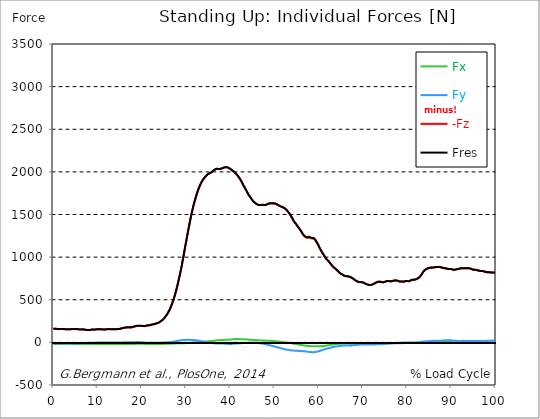
| Category |  Fx |  Fy |  -Fz |  Fres |
|---|---|---|---|---|
| 0.0 | -18 | -13.7 | 156.7 | 158.39 |
| 0.167348456675344 | -18.13 | -13.66 | 158 | 159.68 |
| 0.334696913350688 | -18.24 | -13.47 | 159.26 | 160.92 |
| 0.5020453700260321 | -18.19 | -13.06 | 158.64 | 160.27 |
| 0.669393826701376 | -18.13 | -12.86 | 157.77 | 159.38 |
| 0.83674228337672 | -17.98 | -12.6 | 157.06 | 158.64 |
| 1.0040907400520642 | -17.77 | -12.73 | 155.28 | 156.86 |
| 1.1621420602454444 | -17.77 | -13.19 | 154.67 | 156.3 |
| 1.3294905169207885 | -17.8 | -13.38 | 155.06 | 156.71 |
| 1.4968389735961325 | -17.82 | -13.44 | 155.63 | 157.28 |
| 1.6641874302714765 | -17.86 | -13.28 | 156.57 | 158.2 |
| 1.8315358869468206 | -17.8 | -12.83 | 157.01 | 158.59 |
| 1.9988843436221646 | -17.63 | -12.42 | 156.59 | 158.12 |
| 2.1662328002975086 | -17.47 | -12.3 | 156.05 | 157.56 |
| 2.333581256972853 | -17.38 | -12.37 | 154.94 | 156.46 |
| 2.5009297136481967 | -17.35 | -12.42 | 154.86 | 156.38 |
| 2.6682781703235405 | -17.19 | -11.86 | 154.08 | 155.54 |
| 2.8356266269988843 | -17.06 | -11.65 | 152.4 | 153.85 |
| 3.002975083674229 | -17.08 | -11.97 | 151.99 | 153.47 |
| 3.1703235403495724 | -17.25 | -12.08 | 152.83 | 154.33 |
| 3.337671997024917 | -17.36 | -11.73 | 153.38 | 154.85 |
| 3.4957233172182973 | -17.31 | -11.35 | 152.63 | 154.08 |
| 3.663071773893641 | -17.22 | -11.45 | 151.6 | 153.06 |
| 3.8304202305689854 | -17.47 | -11.9 | 152.64 | 154.15 |
| 3.997768687244329 | -17.7 | -12.18 | 154.41 | 155.94 |
| 4.165117143919673 | -17.82 | -11.82 | 155.73 | 157.24 |
| 4.332465600595017 | -17.82 | -11.31 | 156.08 | 157.55 |
| 4.499814057270361 | -17.78 | -11.21 | 155.1 | 156.56 |
| 4.667162513945706 | -17.8 | -11.35 | 153.89 | 155.39 |
| 4.834510970621049 | -17.97 | -11.43 | 154.51 | 156.04 |
| 5.001859427296393 | -18.07 | -11.4 | 155.52 | 157.05 |
| 5.169207883971737 | -18.12 | -10.92 | 156.31 | 157.81 |
| 5.336556340647081 | -17.92 | -10.04 | 155.46 | 156.89 |
| 5.503904797322425 | -17.82 | -9.98 | 153.88 | 155.31 |
| 5.671253253997769 | -17.9 | -9.58 | 152.66 | 154.09 |
| 5.82930457419115 | -17.9 | -9.61 | 150.69 | 152.14 |
| 5.996653030866494 | -17.9 | -9.68 | 150.47 | 151.93 |
| 6.164001487541838 | -17.97 | -9.57 | 150.63 | 152.11 |
| 6.331349944217181 | -18.12 | -9.41 | 151.04 | 152.53 |
| 6.498698400892526 | -18.3 | -9.04 | 151.43 | 152.93 |
| 6.66604685756787 | -18.61 | -8.69 | 151.46 | 152.98 |
| 6.833395314243213 | -18.87 | -8.15 | 150.94 | 152.47 |
| 7.000743770918558 | -18.89 | -7.53 | 149.54 | 151.05 |
| 7.168092227593902 | -18.88 | -7.05 | 148.2 | 149.7 |
| 7.335440684269246 | -18.75 | -6.93 | 146.45 | 147.94 |
| 7.50278914094459 | -18.63 | -6.68 | 145.25 | 146.73 |
| 7.6701375976199335 | -18.51 | -6.31 | 144.58 | 146.04 |
| 7.837486054295278 | -18.39 | -5.92 | 143.96 | 145.41 |
| 7.995537374488658 | -18.16 | -5.35 | 144 | 145.43 |
| 8.162885831164003 | -18.17 | -4.9 | 144.57 | 145.99 |
| 8.330234287839346 | -18.31 | -4.98 | 145.85 | 147.29 |
| 8.49758274451469 | -18.43 | -4.96 | 147.71 | 149.15 |
| 8.664931201190035 | -18.41 | -4.55 | 149.41 | 150.81 |
| 8.832279657865378 | -18.37 | -4.04 | 150.01 | 151.38 |
| 8.999628114540721 | -18.37 | -3.73 | 149.81 | 151.17 |
| 9.166976571216066 | -18.36 | -3.62 | 149.46 | 150.81 |
| 9.334325027891412 | -18.34 | -3.56 | 149.06 | 150.42 |
| 9.501673484566755 | -18.49 | -3.62 | 150.53 | 151.9 |
| 9.669021941242098 | -18.7 | -3.65 | 152.16 | 153.56 |
| 9.836370397917442 | -18.59 | -2.89 | 153.3 | 154.65 |
| 10.003718854592787 | -18.63 | -2.56 | 153.55 | 154.89 |
| 10.17106731126813 | -18.68 | -2.28 | 153.68 | 155.02 |
| 10.329118631461512 | -18.64 | -2.42 | 152.86 | 154.2 |
| 10.496467088136853 | -18.56 | -2.42 | 153.38 | 154.71 |
| 10.663815544812199 | -18.47 | -2.34 | 153.77 | 155.08 |
| 10.831164001487544 | -18.38 | -2.05 | 153.62 | 154.92 |
| 10.998512458162887 | -18.31 | -1.89 | 152.34 | 153.64 |
| 11.16586091483823 | -18.23 | -1.89 | 150.93 | 152.22 |
| 11.333209371513574 | -18.25 | -2 | 150.14 | 151.44 |
| 11.50055782818892 | -18.33 | -2.29 | 149.81 | 151.12 |
| 11.667906284864264 | -18.38 | -2.48 | 150.41 | 151.71 |
| 11.835254741539607 | -18.33 | -2.5 | 152.01 | 153.28 |
| 12.00260319821495 | -18.25 | -2.43 | 153.45 | 154.7 |
| 12.169951654890292 | -18.13 | -2.05 | 154 | 155.22 |
| 12.337300111565641 | -18.21 | -2.43 | 154.31 | 155.54 |
| 12.504648568240984 | -18.23 | -2.66 | 154.82 | 156.05 |
| 12.662699888434362 | -18.13 | -2.49 | 155.11 | 156.32 |
| 12.830048345109708 | -18.01 | -2.18 | 153.88 | 155.07 |
| 12.997396801785053 | -17.99 | -2.36 | 152.75 | 153.95 |
| 13.164745258460396 | -18.13 | -2.88 | 152.42 | 153.64 |
| 13.33209371513574 | -18.23 | -2.87 | 153.43 | 154.66 |
| 13.499442171811083 | -18.41 | -2.76 | 154.88 | 156.12 |
| 13.666790628486426 | -18.5 | -2.54 | 154.88 | 156.13 |
| 13.834139085161771 | -18.41 | -2.07 | 153.66 | 154.9 |
| 14.001487541837117 | -18.52 | -2.2 | 152.57 | 153.83 |
| 14.16883599851246 | -18.53 | -2.5 | 153.38 | 154.64 |
| 14.336184455187803 | -18.46 | -2.59 | 155.01 | 156.26 |
| 14.503532911863147 | -18.31 | -2.41 | 155.42 | 156.65 |
| 14.670881368538492 | -18.23 | -2.43 | 154.96 | 156.2 |
| 14.828932688731873 | -18.24 | -2.63 | 155.51 | 156.77 |
| 14.996281145407215 | -18.24 | -2.78 | 157.38 | 158.66 |
| 15.163629602082558 | -18.09 | -2.35 | 159.75 | 161.04 |
| 15.330978058757903 | -17.92 | -1.74 | 162.18 | 163.5 |
| 15.498326515433247 | -17.85 | -1.1 | 165.1 | 166.47 |
| 15.665674972108594 | -17.75 | -0.16 | 167.53 | 169 |
| 15.833023428783937 | -17.77 | 0.36 | 168.98 | 170.51 |
| 16.00037188545928 | -17.94 | 0.38 | 170.63 | 172.21 |
| 16.167720342134626 | -18.04 | 0.73 | 172.33 | 173.93 |
| 16.335068798809967 | -18.09 | 1.09 | 173.56 | 175.18 |
| 16.502417255485312 | -18.09 | 1.44 | 174.35 | 176 |
| 16.669765712160658 | -18.09 | 1.83 | 174.81 | 176.49 |
| 16.837114168836 | -18.15 | 1.76 | 174.39 | 176.09 |
| 17.004462625511344 | -18.25 | 1.45 | 174.57 | 176.29 |
| 17.16251394570472 | -18.12 | 1.61 | 176.08 | 177.82 |
| 17.32986240238007 | -18.04 | 2 | 175.88 | 177.65 |
| 17.497210859055414 | -18.15 | 1.71 | 175.24 | 177.05 |
| 17.664559315730756 | -18.4 | 1.23 | 175.79 | 177.64 |
| 17.8319077724061 | -18.56 | 0.99 | 177.67 | 179.58 |
| 17.999256229081443 | -18.66 | 0.98 | 180.21 | 182.15 |
| 18.166604685756788 | -18.73 | 1.04 | 182.56 | 184.58 |
| 18.333953142432133 | -18.52 | 1.76 | 185.07 | 187.24 |
| 18.501301599107478 | -18.01 | 2.73 | 187.87 | 190.16 |
| 18.668650055782823 | -17.3 | 3.46 | 190.7 | 193.05 |
| 18.835998512458165 | -16.69 | 3.7 | 191.84 | 194.19 |
| 19.00334696913351 | -16.03 | 3.8 | 192.99 | 195.33 |
| 19.170695425808855 | -15.79 | 3.71 | 193.76 | 196.04 |
| 19.338043882484197 | -16.07 | 3.05 | 193.34 | 195.56 |
| 19.496095202677576 | -16.23 | 2.74 | 193.9 | 196.1 |
| 19.66344365935292 | -16.38 | 2.32 | 193.6 | 195.75 |
| 19.830792116028263 | -16.66 | 1.21 | 192.34 | 194.35 |
| 19.998140572703612 | -16.94 | 0.7 | 192.71 | 194.71 |
| 20.165489029378953 | -17.24 | 0.11 | 192 | 193.95 |
| 20.3328374860543 | -17.54 | -0.92 | 190.71 | 192.55 |
| 20.500185942729644 | -17.67 | -1.8 | 189.41 | 191.18 |
| 20.667534399404985 | -17.73 | -2.51 | 189.93 | 191.69 |
| 20.83488285608033 | -18.03 | -3.19 | 192.22 | 194.04 |
| 21.002231312755672 | -18.19 | -3.18 | 195.06 | 196.88 |
| 21.16957976943102 | -18.22 | -2.98 | 196.82 | 198.61 |
| 21.336928226106362 | -18.33 | -3.16 | 197.94 | 199.75 |
| 21.504276682781704 | -18.35 | -3.37 | 198.57 | 200.39 |
| 21.67162513945705 | -18.27 | -3.62 | 198.68 | 200.52 |
| 21.82967645965043 | -18.39 | -4.31 | 200.14 | 202.02 |
| 21.997024916325774 | -18.56 | -4.76 | 203.01 | 204.91 |
| 22.16437337300112 | -18.62 | -4.74 | 206.68 | 208.55 |
| 22.33172182967646 | -18.63 | -4.46 | 209.12 | 210.96 |
| 22.499070286351806 | -18.52 | -4.43 | 209.62 | 211.45 |
| 22.666418743027148 | -18.5 | -4.78 | 210.78 | 212.62 |
| 22.833767199702496 | -18.67 | -4.91 | 213.18 | 215.01 |
| 23.00111565637784 | -18.83 | -5.17 | 215.79 | 217.63 |
| 23.168464113053183 | -18.93 | -5.25 | 219.34 | 221.18 |
| 23.335812569728528 | -19.01 | -4.93 | 222.4 | 224.21 |
| 23.50316102640387 | -18.97 | -4.7 | 224.47 | 226.25 |
| 23.670509483079215 | -18.87 | -4.49 | 226.39 | 228.14 |
| 23.83785793975456 | -18.95 | -4.62 | 229.83 | 231.58 |
| 23.995909259947936 | -18.91 | -4.54 | 236.01 | 237.71 |
| 24.163257716623285 | -18.79 | -4 | 242.75 | 244.38 |
| 24.330606173298627 | -18.43 | -3.15 | 249.29 | 250.83 |
| 24.49795462997397 | -18.12 | -2.71 | 255.14 | 256.6 |
| 24.665303086649313 | -17.83 | -2.32 | 260.92 | 262.3 |
| 24.83265154332466 | -17.73 | -2.13 | 269.02 | 270.36 |
| 25.0 | -17.51 | -2.04 | 278.89 | 280.18 |
| 25.167348456675345 | -17.27 | -1.56 | 290.35 | 291.58 |
| 25.334696913350694 | -16.93 | -1.01 | 302.06 | 303.18 |
| 25.502045370026035 | -16.48 | -0.07 | 313.33 | 314.35 |
| 25.669393826701377 | -16.14 | 0.85 | 324.57 | 325.51 |
| 25.836742283376722 | -16.22 | 1.44 | 338.69 | 339.58 |
| 26.004090740052067 | -16.34 | 2.07 | 354.14 | 354.99 |
| 26.17143919672741 | -16.54 | 2.35 | 370.57 | 371.38 |
| 26.329490516920792 | -16.65 | 2.4 | 387.82 | 388.58 |
| 26.49683897359613 | -16.37 | 3.11 | 407.82 | 408.55 |
| 26.66418743027148 | -15.93 | 4.35 | 429 | 429.7 |
| 26.831535886946828 | -15.37 | 5.32 | 451.45 | 452.15 |
| 26.998884343622166 | -14.64 | 6.81 | 475.49 | 476.18 |
| 27.166232800297514 | -13.86 | 8.31 | 501.09 | 501.79 |
| 27.333581256972852 | -13.25 | 9.6 | 528.62 | 529.32 |
| 27.5009297136482 | -12.61 | 11.46 | 558.7 | 559.43 |
| 27.668278170323543 | -12.09 | 13.47 | 589.62 | 590.41 |
| 27.835626626998888 | -11.64 | 15.19 | 621.82 | 622.63 |
| 28.002975083674233 | -11.31 | 16.83 | 656.63 | 657.46 |
| 28.170323540349575 | -11.19 | 18.7 | 693.15 | 694.02 |
| 28.33767199702492 | -11.09 | 20.37 | 731.63 | 732.52 |
| 28.50502045370026 | -11.07 | 21.91 | 770.28 | 771.19 |
| 28.663071773893645 | -11.26 | 23.34 | 808.34 | 809.26 |
| 28.830420230568986 | -11.63 | 24.38 | 848.52 | 849.42 |
| 28.99776868724433 | -11.74 | 25.42 | 891.6 | 892.49 |
| 29.165117143919673 | -11.05 | 26.66 | 938.45 | 939.33 |
| 29.33246560059502 | -10.67 | 27.4 | 986.06 | 986.9 |
| 29.499814057270367 | -10.36 | 28.15 | 1032.79 | 1033.61 |
| 29.66716251394571 | -9.78 | 28.75 | 1080.81 | 1081.61 |
| 29.834510970621054 | -9.18 | 29.43 | 1130.48 | 1131.26 |
| 30.00185942729639 | -8.86 | 29.84 | 1175.79 | 1176.55 |
| 30.169207883971744 | -8.08 | 30.2 | 1222 | 1222.74 |
| 30.33655634064708 | -7.12 | 30.46 | 1268.85 | 1269.56 |
| 30.50390479732243 | -6.32 | 30.45 | 1315.56 | 1316.24 |
| 30.671253253997772 | -5.66 | 30.34 | 1361.31 | 1361.96 |
| 30.829304574191156 | -5.1 | 29.86 | 1405.2 | 1405.81 |
| 30.996653030866494 | -4.58 | 29.2 | 1448.47 | 1449.06 |
| 31.164001487541842 | -3.99 | 28.87 | 1489.33 | 1489.91 |
| 31.331349944217187 | -3.25 | 28.56 | 1528.22 | 1528.78 |
| 31.498698400892525 | -2.4 | 27.92 | 1565.98 | 1566.54 |
| 31.666046857567874 | -1.49 | 27.14 | 1601.75 | 1602.3 |
| 31.833395314243212 | -0.62 | 26.53 | 1634.68 | 1635.22 |
| 32.00074377091856 | 0.19 | 26.1 | 1665.57 | 1666.11 |
| 32.1680922275939 | 0.95 | 25.46 | 1695.13 | 1695.66 |
| 32.33544068426925 | 1.66 | 23.81 | 1724.49 | 1725 |
| 32.50278914094459 | 2.36 | 22.24 | 1752.42 | 1752.92 |
| 32.670137597619934 | 3.06 | 20.95 | 1778.27 | 1778.75 |
| 32.83748605429528 | 3.78 | 19.66 | 1802.02 | 1802.49 |
| 33.004834510970625 | 4.55 | 18.46 | 1823.48 | 1823.93 |
| 33.162885831164004 | 5.2 | 16.96 | 1843.32 | 1843.77 |
| 33.33023428783935 | 5.68 | 15.09 | 1861.81 | 1862.24 |
| 33.497582744514695 | 6.23 | 13.24 | 1878.95 | 1879.35 |
| 33.664931201190036 | 7.07 | 11.52 | 1894.29 | 1894.68 |
| 33.83227965786538 | 7.79 | 9.78 | 1908.14 | 1908.51 |
| 33.99962811454073 | 8.3 | 8.02 | 1920.41 | 1920.76 |
| 34.16697657121607 | 8.93 | 6.55 | 1931.32 | 1931.65 |
| 34.33432502789141 | 9.41 | 4.84 | 1941.81 | 1942.13 |
| 34.50167348456676 | 10.22 | 3.39 | 1951.05 | 1951.37 |
| 34.6690219412421 | 11.12 | 1.86 | 1960.36 | 1960.68 |
| 34.83637039791744 | 12.01 | 0.33 | 1969.67 | 1969.98 |
| 35.00371885459279 | 12.69 | -1.19 | 1976.15 | 1976.46 |
| 35.17106731126814 | 13.4 | -2.22 | 1979.93 | 1980.24 |
| 35.338415767943474 | 13.69 | -2.87 | 1981.57 | 1981.87 |
| 35.49646708813686 | 14.26 | -4.26 | 1986.96 | 1987.24 |
| 35.6638155448122 | 15.1 | -5.53 | 1993.25 | 1993.52 |
| 35.831164001487544 | 16.19 | -6.61 | 2000.28 | 2000.55 |
| 35.998512458162885 | 17.02 | -7.99 | 2007.52 | 2007.79 |
| 36.165860914838234 | 18.1 | -9.53 | 2014.99 | 2015.26 |
| 36.333209371513576 | 19.58 | -10.51 | 2021.54 | 2021.81 |
| 36.50055782818892 | 20.82 | -11.67 | 2027.09 | 2027.38 |
| 36.667906284864266 | 21.76 | -12.68 | 2031.19 | 2031.5 |
| 36.83525474153961 | 22.9 | -13.51 | 2034.44 | 2034.76 |
| 37.002603198214956 | 23.93 | -14.08 | 2036.03 | 2036.37 |
| 37.1699516548903 | 24.86 | -13.87 | 2035.58 | 2035.93 |
| 37.337300111565646 | 25.52 | -13.66 | 2034.29 | 2034.65 |
| 37.50464856824098 | 25.79 | -13.68 | 2033.41 | 2033.77 |
| 37.66269988843437 | 26.67 | -13.5 | 2035.01 | 2035.39 |
| 37.83004834510971 | 27.15 | -13.6 | 2036.82 | 2037.21 |
| 37.99739680178505 | 27.73 | -13.7 | 2038.6 | 2039 |
| 38.16474525846039 | 28.37 | -13.64 | 2040.92 | 2041.32 |
| 38.33209371513574 | 28.46 | -13.94 | 2044.74 | 2045.14 |
| 38.49944217181109 | 28.45 | -14.73 | 2048.79 | 2049.19 |
| 38.666790628486424 | 28.44 | -15.73 | 2052.42 | 2052.82 |
| 38.83413908516178 | 28.81 | -16.33 | 2054.01 | 2054.41 |
| 39.001487541837115 | 29.94 | -16.35 | 2054.56 | 2054.98 |
| 39.16883599851246 | 30.34 | -16.96 | 2054.3 | 2054.72 |
| 39.336184455187805 | 30.7 | -17.72 | 2052.54 | 2052.97 |
| 39.503532911863154 | 31.36 | -17.96 | 2049.43 | 2049.86 |
| 39.670881368538495 | 31.71 | -18.27 | 2045.4 | 2045.83 |
| 39.83822982521384 | 32.09 | -18.59 | 2040.71 | 2041.15 |
| 39.996281145407224 | 33.05 | -18.42 | 2034.5 | 2034.95 |
| 40.163629602082565 | 33.9 | -18.27 | 2028.23 | 2028.69 |
| 40.33097805875791 | 34.6 | -18.02 | 2021.74 | 2022.21 |
| 40.498326515433256 | 35.91 | -16.97 | 2014.7 | 2015.2 |
| 40.6656749721086 | 36.8 | -16.06 | 2007.75 | 2008.26 |
| 40.83302342878393 | 37.42 | -15.41 | 2000.89 | 2001.41 |
| 41.00037188545929 | 37.9 | -14.9 | 1994.08 | 1994.61 |
| 41.16772034213463 | 38.12 | -14.15 | 1986.08 | 1986.63 |
| 41.33506879880997 | 38.23 | -14.05 | 1976.58 | 1977.14 |
| 41.50241725548531 | 38.07 | -14.18 | 1966.57 | 1967.13 |
| 41.66976571216066 | 38.17 | -13.25 | 1956.37 | 1956.94 |
| 41.837114168836 | 38.12 | -12.66 | 1944.81 | 1945.39 |
| 42.004462625511344 | 38.1 | -11.93 | 1932.06 | 1932.64 |
| 42.17181108218669 | 37.8 | -11.71 | 1919.32 | 1919.92 |
| 42.32986240238007 | 37.5 | -11.27 | 1905.79 | 1906.4 |
| 42.497210859055414 | 37.3 | -10.53 | 1890.92 | 1891.54 |
| 42.66455931573076 | 37.17 | -9.23 | 1874.6 | 1875.22 |
| 42.831907772406105 | 36.98 | -7.82 | 1856.66 | 1857.28 |
| 42.999256229081446 | 36.72 | -6.73 | 1839 | 1839.62 |
| 43.16660468575679 | 36.22 | -6.61 | 1823.67 | 1824.32 |
| 43.33395314243214 | 35.51 | -6.93 | 1808.59 | 1809.25 |
| 43.50130159910748 | 34.67 | -7.52 | 1792.94 | 1793.62 |
| 43.66865005578282 | 34.01 | -7.16 | 1777.28 | 1777.97 |
| 43.83599851245817 | 33.25 | -6.78 | 1761.56 | 1762.24 |
| 44.00334696913351 | 32.79 | -6.23 | 1743.82 | 1744.49 |
| 44.17069542580886 | 32.29 | -5.47 | 1728.77 | 1729.45 |
| 44.3380438824842 | 31.8 | -4.59 | 1715.94 | 1716.61 |
| 44.49609520267758 | 31.32 | -4.19 | 1703.93 | 1704.62 |
| 44.66344365935292 | 30.87 | -3.52 | 1691.81 | 1692.49 |
| 44.83079211602827 | 30.29 | -2.65 | 1679.95 | 1680.64 |
| 44.99814057270361 | 29.51 | -2.25 | 1668.24 | 1668.91 |
| 45.16548902937895 | 28.61 | -2.28 | 1655.96 | 1656.62 |
| 45.332837486054295 | 27.89 | -2.96 | 1646.55 | 1647.22 |
| 45.500185942729644 | 27.33 | -3.44 | 1640.36 | 1641.02 |
| 45.66753439940499 | 26.64 | -4.38 | 1633.47 | 1634.12 |
| 45.83488285608033 | 25.95 | -5.34 | 1626.77 | 1627.41 |
| 46.00223131275568 | 25.3 | -6.49 | 1621.7 | 1622.34 |
| 46.16957976943102 | 24.6 | -7.55 | 1616.08 | 1616.72 |
| 46.336928226106366 | 24.2 | -8.48 | 1613.21 | 1613.86 |
| 46.50427668278171 | 23.84 | -9.24 | 1610.92 | 1611.57 |
| 46.671625139457056 | 23.47 | -10.1 | 1609.15 | 1609.8 |
| 46.829676459650436 | 23.34 | -11.02 | 1609.83 | 1610.48 |
| 46.99702491632577 | 23.16 | -12.1 | 1611.17 | 1611.81 |
| 47.16437337300112 | 22.89 | -13.41 | 1612.86 | 1613.5 |
| 47.33172182967646 | 22.43 | -14.88 | 1613.18 | 1613.81 |
| 47.49907028635181 | 21.95 | -16.37 | 1612.67 | 1613.31 |
| 47.66641874302716 | 21.24 | -17.94 | 1610.8 | 1611.45 |
| 47.83376719970249 | 20.47 | -19.68 | 1609.57 | 1610.22 |
| 48.001115656377834 | 20.13 | -21.78 | 1612.33 | 1612.99 |
| 48.16846411305319 | 20.05 | -24.03 | 1616.4 | 1617.08 |
| 48.33581256972853 | 19.92 | -26.27 | 1620.27 | 1620.96 |
| 48.50316102640387 | 19.72 | -28.51 | 1623.79 | 1624.51 |
| 48.67050948307921 | 19.45 | -30.55 | 1626.65 | 1627.39 |
| 48.837857939754564 | 19.11 | -32.39 | 1628.85 | 1629.6 |
| 49.005206396429905 | 18.79 | -34.28 | 1630.87 | 1631.62 |
| 49.163257716623285 | 18.46 | -36.35 | 1631.07 | 1631.85 |
| 49.33060617329863 | 17.8 | -38.31 | 1629.03 | 1629.83 |
| 49.49795462997397 | 17.17 | -40.58 | 1629.7 | 1630.53 |
| 49.66530308664932 | 16.47 | -42.84 | 1630.59 | 1631.44 |
| 49.832651543324666 | 15.61 | -45.5 | 1629.93 | 1630.81 |
| 50.0 | 14.73 | -48.24 | 1629.01 | 1629.94 |
| 50.16734845667534 | 14.02 | -50.77 | 1627.69 | 1628.67 |
| 50.33469691335069 | 13.46 | -53.08 | 1625.14 | 1626.18 |
| 50.50204537002604 | 12.71 | -55.04 | 1619.68 | 1620.78 |
| 50.66939382670139 | 11.83 | -57.37 | 1614.61 | 1615.77 |
| 50.836742283376715 | 10.86 | -59.79 | 1609.44 | 1610.67 |
| 51.00409074005207 | 9.67 | -62.47 | 1604.01 | 1605.33 |
| 51.17143919672741 | 8.42 | -64.99 | 1598.94 | 1600.35 |
| 51.32949051692079 | 7.16 | -67.39 | 1594.36 | 1595.86 |
| 51.496838973596134 | 6.1 | -69.82 | 1592.53 | 1594.13 |
| 51.66418743027148 | 5.2 | -72.09 | 1589.04 | 1590.75 |
| 51.831535886946824 | 4.18 | -74.29 | 1584.96 | 1586.79 |
| 51.99888434362217 | 3.4 | -76.59 | 1580.97 | 1582.9 |
| 52.16623280029752 | 2.5 | -78.82 | 1575.94 | 1577.99 |
| 52.33358125697285 | 1.37 | -80.98 | 1570.3 | 1572.47 |
| 52.5009297136482 | 0.08 | -82.85 | 1563.12 | 1565.41 |
| 52.668278170323546 | -1.2 | -84.53 | 1555.27 | 1557.67 |
| 52.835626626998895 | -2.4 | -86 | 1546.3 | 1548.79 |
| 53.00297508367424 | -3.71 | -87.53 | 1535.23 | 1537.83 |
| 53.17032354034958 | -4.96 | -89.04 | 1523.67 | 1526.39 |
| 53.33767199702492 | -6.14 | -90.57 | 1512.11 | 1514.95 |
| 53.50502045370027 | -7.38 | -92.03 | 1499.74 | 1502.69 |
| 53.663071773893655 | -8.69 | -93.35 | 1486.07 | 1489.12 |
| 53.83042023056899 | -10.17 | -94.56 | 1471.25 | 1474.42 |
| 53.99776868724433 | -11.75 | -95.52 | 1455.85 | 1459.14 |
| 54.16511714391967 | -13.38 | -96.16 | 1439.71 | 1443.09 |
| 54.33246560059503 | -15.13 | -96.47 | 1423.25 | 1426.7 |
| 54.49981405727037 | -16.74 | -97 | 1409.87 | 1413.4 |
| 54.667162513945705 | -18.33 | -97.77 | 1399.15 | 1402.78 |
| 54.834510970621054 | -19.75 | -97.97 | 1388.86 | 1392.54 |
| 55.0018594272964 | -21.33 | -98.09 | 1377.94 | 1381.7 |
| 55.169207883971744 | -22.84 | -98.52 | 1364.14 | 1368 |
| 55.336556340647086 | -24.26 | -99.14 | 1350.44 | 1354.41 |
| 55.50390479732243 | -25.73 | -100.18 | 1339.82 | 1343.91 |
| 55.671253253997776 | -27.2 | -101.02 | 1328.6 | 1332.8 |
| 55.83860171067312 | -28.7 | -101.04 | 1315 | 1319.27 |
| 55.9966530308665 | -30.18 | -101.78 | 1303.23 | 1307.63 |
| 56.16400148754184 | -31.8 | -102.53 | 1289.2 | 1293.73 |
| 56.33134994421718 | -33.23 | -102.68 | 1274 | 1278.63 |
| 56.498698400892536 | -34.41 | -102.7 | 1259.87 | 1264.57 |
| 56.66604685756788 | -35.62 | -102.78 | 1249.27 | 1254.05 |
| 56.83339531424321 | -36.91 | -103.32 | 1241.71 | 1246.61 |
| 57.00074377091856 | -38.32 | -104.7 | 1235.8 | 1240.89 |
| 57.16809222759391 | -39.58 | -106.02 | 1230.27 | 1235.56 |
| 57.33544068426925 | -40.47 | -107.42 | 1226.33 | 1231.83 |
| 57.5027891409446 | -41.2 | -109.35 | 1226.2 | 1231.95 |
| 57.670137597619934 | -41.85 | -111.53 | 1229.16 | 1235.17 |
| 57.83748605429528 | -42.53 | -113.45 | 1231.69 | 1237.93 |
| 58.004834510970625 | -43.34 | -113.98 | 1226.6 | 1232.97 |
| 58.16288583116401 | -44.02 | -114.73 | 1222.61 | 1229.14 |
| 58.330234287839346 | -44.5 | -114.1 | 1214.32 | 1220.88 |
| 58.497582744514695 | -45.18 | -114.68 | 1219.15 | 1225.78 |
| 58.66493120119004 | -46.01 | -115.19 | 1218.51 | 1225.21 |
| 58.832279657865385 | -46.54 | -115.42 | 1217.83 | 1224.58 |
| 58.999628114540734 | -46.42 | -114.61 | 1211.88 | 1218.58 |
| 59.16697657121607 | -46.25 | -113.38 | 1202.98 | 1209.6 |
| 59.33432502789142 | -46.43 | -111.88 | 1189.57 | 1196.1 |
| 59.50167348456676 | -46.54 | -110.22 | 1174.99 | 1181.44 |
| 59.66902194124211 | -46.78 | -108.38 | 1159.9 | 1166.26 |
| 59.83637039791745 | -47.17 | -106.8 | 1144.49 | 1150.78 |
| 60.00371885459278 | -46.76 | -104.13 | 1126.85 | 1132.94 |
| 60.17106731126813 | -45.8 | -100.66 | 1107.38 | 1113.15 |
| 60.33841576794349 | -45.57 | -97.87 | 1091.28 | 1096.83 |
| 60.49646708813685 | -45.2 | -95.28 | 1077.19 | 1082.55 |
| 60.6638155448122 | -44.53 | -92.47 | 1061.65 | 1066.79 |
| 60.831164001487544 | -43.7 | -89.62 | 1046.31 | 1051.23 |
| 60.99851245816289 | -43.18 | -87.08 | 1032.69 | 1037.43 |
| 61.16586091483824 | -42.52 | -84.41 | 1019.56 | 1024.09 |
| 61.333209371513576 | -41.36 | -81.34 | 1005.86 | 1010.14 |
| 61.50055782818892 | -40.04 | -78.22 | 992.27 | 996.3 |
| 61.667906284864266 | -38.7 | -75.26 | 979.13 | 982.93 |
| 61.835254741539615 | -37.22 | -73.04 | 969.23 | 972.84 |
| 62.002603198214956 | -35.65 | -71.4 | 961.87 | 965.33 |
| 62.16995165489029 | -34.07 | -69.67 | 954.08 | 957.39 |
| 62.33730011156564 | -32.45 | -67.45 | 943.81 | 946.94 |
| 62.504648568240995 | -30.89 | -65.31 | 932.79 | 935.76 |
| 62.67199702491633 | -29.34 | -62.45 | 921.18 | 923.95 |
| 62.83004834510971 | -27.83 | -59.63 | 910.55 | 913.11 |
| 62.99739680178505 | -26.17 | -56.96 | 900.46 | 902.84 |
| 63.1647452584604 | -24.64 | -54.24 | 890.47 | 892.66 |
| 63.33209371513575 | -23.3 | -52.35 | 881.95 | 884.02 |
| 63.4994421718111 | -22.16 | -51.02 | 874.73 | 876.72 |
| 63.666790628486424 | -21.04 | -49.71 | 867.49 | 869.4 |
| 63.83413908516177 | -20.1 | -48.82 | 859.94 | 861.8 |
| 64.00148754183712 | -19.16 | -47.93 | 852.39 | 854.21 |
| 64.16883599851248 | -18.35 | -47.25 | 844.63 | 846.42 |
| 64.3361844551878 | -17.55 | -45.95 | 835.37 | 837.08 |
| 64.50353291186315 | -16.94 | -44.01 | 826.05 | 827.67 |
| 64.6708813685385 | -16.41 | -42.15 | 817.5 | 819.05 |
| 64.83822982521384 | -15.68 | -40.11 | 810.31 | 811.76 |
| 65.00557828188919 | -15.1 | -38.81 | 804.44 | 805.82 |
| 65.16362960208257 | -14.26 | -39.08 | 801.03 | 802.43 |
| 65.3309780587579 | -14.04 | -38.73 | 795.84 | 797.24 |
| 65.49832651543326 | -14.25 | -38.25 | 789.64 | 791.06 |
| 65.6656749721086 | -14.12 | -37.01 | 783.56 | 784.96 |
| 65.83302342878395 | -14.05 | -35.8 | 778.52 | 779.86 |
| 66.00037188545929 | -13.36 | -35.69 | 776.5 | 777.85 |
| 66.16772034213463 | -13.24 | -37.13 | 776.94 | 778.39 |
| 66.33506879880998 | -13.65 | -38.2 | 776.63 | 778.18 |
| 66.50241725548531 | -14.12 | -38.72 | 775 | 776.64 |
| 66.66976571216065 | -13.91 | -37.99 | 771.83 | 773.45 |
| 66.83711416883601 | -14.2 | -38.25 | 771.3 | 772.96 |
| 67.00446262551135 | -14.38 | -38.02 | 769.24 | 770.9 |
| 67.1718110821867 | -14.68 | -37.37 | 765.66 | 767.31 |
| 67.32986240238007 | -15.08 | -36.36 | 760.92 | 762.53 |
| 67.49721085905541 | -15.35 | -35.18 | 755.97 | 757.53 |
| 67.66455931573076 | -15.46 | -34.09 | 750.72 | 752.24 |
| 67.83190777240611 | -15.4 | -33.05 | 744.64 | 746.13 |
| 67.99925622908145 | -15.36 | -32.33 | 738.03 | 739.49 |
| 68.16660468575678 | -15.52 | -31.81 | 731.61 | 733.06 |
| 68.33395314243214 | -15.81 | -31.38 | 725.33 | 726.77 |
| 68.50130159910749 | -16 | -30.82 | 719.74 | 721.16 |
| 68.66865005578282 | -16.16 | -30.17 | 714.79 | 716.17 |
| 68.83599851245816 | -16.21 | -29.45 | 710.84 | 712.18 |
| 69.00334696913352 | -16.22 | -28.56 | 708.15 | 709.45 |
| 69.17069542580886 | -16.15 | -27.55 | 706.79 | 708.03 |
| 69.3380438824842 | -16.11 | -26.57 | 706 | 707.19 |
| 69.50539233915956 | -15.79 | -26.06 | 705.71 | 706.85 |
| 69.66344365935292 | -15.6 | -26.08 | 705.37 | 706.51 |
| 69.83079211602826 | -15.41 | -26.1 | 705.04 | 706.17 |
| 69.99814057270362 | -15.46 | -26.04 | 702.66 | 703.77 |
| 70.16548902937896 | -15.74 | -25.66 | 699.34 | 700.42 |
| 70.33283748605429 | -16.08 | -25.63 | 694.89 | 695.96 |
| 70.50018594272964 | -16.51 | -25.67 | 690.29 | 691.35 |
| 70.667534399405 | -17.02 | -25.53 | 685.33 | 686.4 |
| 70.83488285608033 | -17.57 | -25.8 | 680.91 | 681.99 |
| 71.00223131275568 | -17.92 | -25.61 | 678.26 | 679.33 |
| 71.16957976943102 | -18.25 | -25.79 | 675.73 | 676.81 |
| 71.33692822610637 | -18.5 | -26.06 | 673.47 | 674.57 |
| 71.50427668278171 | -18.55 | -25.9 | 672.71 | 673.82 |
| 71.67162513945706 | -18.63 | -25.88 | 672.93 | 674.04 |
| 71.8389735961324 | -18.64 | -25.62 | 674.34 | 675.44 |
| 71.99702491632577 | -18.71 | -25.14 | 676.15 | 677.22 |
| 72.16437337300113 | -18.56 | -24.72 | 679.29 | 680.34 |
| 72.33172182967647 | -18.33 | -24.44 | 682.73 | 683.76 |
| 72.49907028635181 | -18.11 | -24.13 | 687.11 | 688.1 |
| 72.66641874302715 | -17.84 | -23.97 | 691.54 | 692.52 |
| 72.8337671997025 | -17.31 | -23.71 | 696.55 | 697.48 |
| 73.00111565637783 | -16.62 | -23.25 | 701.99 | 702.88 |
| 73.16846411305319 | -16.01 | -22.84 | 705.97 | 706.81 |
| 73.33581256972853 | -15.48 | -22.73 | 709.51 | 710.32 |
| 73.50316102640387 | -15.21 | -23.17 | 711.62 | 712.42 |
| 73.67050948307921 | -15.05 | -23.03 | 711.97 | 712.76 |
| 73.83785793975457 | -15.01 | -22.91 | 711.28 | 712.05 |
| 74.00520639642991 | -14.99 | -22.54 | 709.79 | 710.56 |
| 74.16325771662328 | -14.96 | -21.65 | 707.89 | 708.64 |
| 74.33060617329863 | -14.88 | -20.67 | 706.07 | 706.8 |
| 74.49795462997398 | -14.54 | -19.57 | 704.96 | 705.66 |
| 74.66530308664932 | -14.15 | -18.75 | 705.34 | 706 |
| 74.83265154332466 | -13.3 | -18.01 | 707.01 | 707.66 |
| 75.00000000000001 | -12.46 | -17.34 | 710.3 | 710.93 |
| 75.16734845667534 | -11.67 | -16.73 | 714.13 | 714.75 |
| 75.3346969133507 | -11.21 | -15.69 | 717.91 | 718.52 |
| 75.50204537002605 | -11.1 | -14.64 | 720 | 720.62 |
| 75.66939382670138 | -11.17 | -14.04 | 720.54 | 721.15 |
| 75.83674228337672 | -11.11 | -13.99 | 719.43 | 720.03 |
| 76.00409074005208 | -11.44 | -13.48 | 716.86 | 717.44 |
| 76.17143919672742 | -11.71 | -13.06 | 715.48 | 716.05 |
| 76.33878765340276 | -11.55 | -12.09 | 715.92 | 716.5 |
| 76.49683897359614 | -11.2 | -11.11 | 717.04 | 717.6 |
| 76.66418743027148 | -10.59 | -10.29 | 719.43 | 719.98 |
| 76.83153588694682 | -9.98 | -9.48 | 722.45 | 723.02 |
| 76.99888434362218 | -9.4 | -8.7 | 725.09 | 725.67 |
| 77.16623280029752 | -9.42 | -8.38 | 724.44 | 725.02 |
| 77.33358125697285 | -9.46 | -8.13 | 724.46 | 725.04 |
| 77.5009297136482 | -9.12 | -7.69 | 725.5 | 726.08 |
| 77.66827817032356 | -8.83 | -7.22 | 725.62 | 726.2 |
| 77.83562662699889 | -9 | -6.74 | 723.29 | 723.88 |
| 78.00297508367423 | -9.27 | -6.11 | 719.66 | 720.25 |
| 78.17032354034959 | -9.42 | -5.57 | 715.78 | 716.37 |
| 78.33767199702493 | -9.49 | -4.99 | 713.22 | 713.81 |
| 78.50502045370027 | -9.39 | -4.26 | 712.65 | 713.24 |
| 78.67236891037561 | -8.83 | -3.73 | 713.35 | 713.94 |
| 78.83042023056899 | -8.58 | -3.52 | 713.49 | 714.07 |
| 78.99776868724433 | -8.9 | -3.26 | 712.17 | 712.76 |
| 79.16511714391969 | -8.99 | -2.9 | 711.64 | 712.22 |
| 79.33246560059503 | -8.67 | -2.46 | 713.14 | 713.7 |
| 79.49981405727036 | -8.2 | -2.14 | 715.97 | 716.51 |
| 79.66716251394571 | -7.74 | -2.04 | 718.49 | 719.03 |
| 79.83451097062107 | -7.7 | -2.47 | 719.53 | 720.07 |
| 80.00185942729641 | -7.95 | -2.64 | 718.98 | 719.52 |
| 80.16920788397174 | -8.21 | -2.64 | 717.11 | 717.64 |
| 80.33655634064709 | -8.33 | -2.5 | 716.48 | 716.99 |
| 80.50390479732243 | -8.1 | -2.23 | 718.65 | 719.15 |
| 80.67125325399778 | -7.54 | -2.27 | 722.4 | 722.91 |
| 80.83860171067312 | -6.76 | -2.19 | 727.62 | 728.14 |
| 80.99665303086651 | -6.13 | -2.16 | 732.01 | 732.54 |
| 81.16400148754184 | -5.95 | -2.29 | 734 | 734.52 |
| 81.3313499442172 | -5.87 | -2.04 | 735.72 | 736.23 |
| 81.49869840089255 | -6.14 | -1.94 | 735.07 | 735.57 |
| 81.66604685756786 | -6.41 | -1.83 | 734.36 | 734.87 |
| 81.83339531424322 | -6.13 | -1.44 | 736.59 | 737.09 |
| 82.00074377091858 | -5.57 | -1.06 | 740.54 | 741.04 |
| 82.16809222759392 | -5.11 | -0.91 | 744.44 | 744.94 |
| 82.33544068426926 | -4.74 | -0.91 | 748.17 | 748.66 |
| 82.50278914094459 | -4.39 | -0.15 | 753.07 | 753.53 |
| 82.67013759761994 | -4.02 | 1.36 | 759.41 | 759.83 |
| 82.83748605429528 | -3.45 | 3.06 | 767.16 | 767.55 |
| 83.00483451097062 | -2.54 | 5.23 | 777.11 | 777.47 |
| 83.17218296764597 | -1.56 | 6.77 | 787.17 | 787.52 |
| 83.33023428783935 | 0.04 | 8.1 | 802.28 | 802.64 |
| 83.4975827445147 | 1.56 | 9.3 | 817.13 | 817.51 |
| 83.66493120119004 | 2.73 | 10.16 | 830.67 | 831.06 |
| 83.83227965786537 | 3.34 | 10.66 | 841.08 | 841.47 |
| 83.99962811454073 | 4.09 | 11.65 | 848.85 | 849.25 |
| 84.16697657121607 | 4.56 | 12.29 | 855.28 | 855.68 |
| 84.33432502789142 | 4.37 | 12.62 | 859.87 | 860.27 |
| 84.50167348456677 | 4.28 | 12.76 | 864.78 | 865.19 |
| 84.6690219412421 | 4.41 | 12.88 | 868.53 | 868.94 |
| 84.83637039791745 | 4.47 | 13.05 | 870.1 | 870.52 |
| 85.0037188545928 | 4.85 | 13.89 | 872.09 | 872.54 |
| 85.17106731126813 | 5.42 | 15.06 | 874.78 | 875.27 |
| 85.33841576794349 | 5.79 | 15.66 | 876.68 | 877.2 |
| 85.50576422461883 | 6.2 | 15.92 | 877 | 877.55 |
| 85.66381554481221 | 6.54 | 16.5 | 876.81 | 877.38 |
| 85.83116400148755 | 7.01 | 16.85 | 877.44 | 878.04 |
| 85.99851245816289 | 7.66 | 17.48 | 878.6 | 879.25 |
| 86.16586091483823 | 7.89 | 18 | 878.77 | 879.45 |
| 86.33320937151358 | 8.03 | 18.24 | 880.84 | 881.53 |
| 86.50055782818893 | 8.25 | 18.48 | 883.39 | 884.1 |
| 86.66790628486427 | 8.35 | 18.6 | 884.87 | 885.59 |
| 86.83525474153961 | 8.17 | 18.61 | 885.09 | 885.81 |
| 87.00260319821496 | 7.76 | 18.57 | 884.54 | 885.26 |
| 87.16995165489031 | 7.27 | 18.88 | 883.46 | 884.19 |
| 87.33730011156564 | 6.94 | 19.14 | 882.71 | 883.44 |
| 87.504648568241 | 6.99 | 19.25 | 882.7 | 883.43 |
| 87.67199702491634 | 6.96 | 19.92 | 880.53 | 881.26 |
| 87.83004834510972 | 6.89 | 20.86 | 877.36 | 878.09 |
| 87.99739680178506 | 6.77 | 21.79 | 874.46 | 875.19 |
| 88.1647452584604 | 6.84 | 22.97 | 872.14 | 872.89 |
| 88.33209371513574 | 6.93 | 23.71 | 870.77 | 871.53 |
| 88.49944217181108 | 6.95 | 23.86 | 870.1 | 870.85 |
| 88.66679062848644 | 6.94 | 24.32 | 868.6 | 869.35 |
| 88.83413908516178 | 6.88 | 24.79 | 866.6 | 867.37 |
| 89.00148754183712 | 6.55 | 24.11 | 863.83 | 864.55 |
| 89.16883599851246 | 6.5 | 24.15 | 862.39 | 863.1 |
| 89.33618445518782 | 6.61 | 24.32 | 861.37 | 862.09 |
| 89.50353291186315 | 6.93 | 24.73 | 861.47 | 862.2 |
| 89.6708813685385 | 7.05 | 24.84 | 860.97 | 861.71 |
| 89.83822982521386 | 7.03 | 24.68 | 860.4 | 861.13 |
| 90.00557828188919 | 6.77 | 23.91 | 859.05 | 859.74 |
| 90.16362960208257 | 5.87 | 21.64 | 854.53 | 855.13 |
| 90.3309780587579 | 5.51 | 20.38 | 852.62 | 853.18 |
| 90.49832651543326 | 5.61 | 19.97 | 852.84 | 853.38 |
| 90.66567497210859 | 5.74 | 20 | 852.25 | 852.8 |
| 90.83302342878395 | 5.77 | 18.93 | 852.39 | 852.93 |
| 91.00037188545929 | 5.72 | 18.09 | 853.57 | 854.09 |
| 91.16772034213463 | 5.74 | 17.79 | 856.1 | 856.63 |
| 91.33506879880998 | 5.9 | 17.24 | 859.62 | 860.15 |
| 91.50241725548533 | 5.9 | 16.98 | 861.37 | 861.9 |
| 91.66976571216065 | 5.7 | 16.94 | 863.04 | 863.57 |
| 91.83711416883601 | 5.76 | 17.08 | 864.87 | 865.4 |
| 92.00446262551137 | 5.87 | 17.2 | 866.85 | 867.39 |
| 92.1718110821867 | 5.95 | 17.3 | 868.91 | 869.45 |
| 92.33915953886203 | 6.01 | 17.47 | 869.63 | 870.19 |
| 92.49721085905541 | 6.06 | 17.64 | 870.17 | 870.75 |
| 92.66455931573077 | 6.1 | 17.87 | 870.24 | 870.84 |
| 92.83190777240611 | 5.86 | 17.83 | 870.32 | 870.92 |
| 92.99925622908145 | 5.59 | 17.67 | 870.29 | 870.89 |
| 93.1666046857568 | 5.47 | 17.32 | 869.86 | 870.45 |
| 93.33395314243214 | 5.4 | 17.15 | 869.92 | 870.49 |
| 93.50130159910749 | 5.36 | 17.06 | 870.26 | 870.82 |
| 93.66865005578283 | 5.24 | 16.7 | 870.59 | 871.14 |
| 93.83599851245818 | 5.14 | 16.43 | 870.06 | 870.6 |
| 94.00334696913353 | 4.86 | 16.09 | 868.46 | 869 |
| 94.17069542580886 | 4.5 | 15.7 | 866.87 | 867.42 |
| 94.3380438824842 | 4.51 | 15.66 | 865.39 | 865.93 |
| 94.50539233915954 | 4.18 | 15.44 | 861.75 | 862.28 |
| 94.66344365935292 | 3.59 | 15.05 | 856.85 | 857.37 |
| 94.83079211602828 | 3.05 | 14.85 | 853.12 | 853.63 |
| 94.99814057270362 | 2.67 | 14.94 | 851.73 | 852.24 |
| 95.16548902937897 | 2.64 | 15.13 | 851.99 | 852.48 |
| 95.33283748605432 | 2.67 | 15.17 | 851.64 | 852.12 |
| 95.50018594272963 | 2.87 | 15.23 | 851.09 | 851.56 |
| 95.66753439940499 | 3.05 | 15.53 | 849.89 | 850.35 |
| 95.83488285608034 | 2.75 | 15.65 | 846.71 | 847.17 |
| 96.00223131275567 | 2.1 | 15.77 | 843.4 | 843.86 |
| 96.16957976943102 | 2 | 15.94 | 841.89 | 842.34 |
| 96.33692822610638 | 1.7 | 16.17 | 840.16 | 840.61 |
| 96.50427668278171 | 1.37 | 16.61 | 838.16 | 838.61 |
| 96.67162513945706 | 1.29 | 17.1 | 837.66 | 838.11 |
| 96.8389735961324 | 1.34 | 17.64 | 837.4 | 837.86 |
| 96.99702491632577 | 1.43 | 17.69 | 836.58 | 837.03 |
| 97.16437337300111 | 1.35 | 17.52 | 834.88 | 835.32 |
| 97.33172182967647 | 1.24 | 17.42 | 832.7 | 833.13 |
| 97.49907028635181 | 0.87 | 17.3 | 829.92 | 830.34 |
| 97.66641874302715 | 0.64 | 17.41 | 827.51 | 827.93 |
| 97.8337671997025 | 0.56 | 17.73 | 825.41 | 825.84 |
| 98.00111565637785 | 0.13 | 18.11 | 823.63 | 824.05 |
| 98.16846411305319 | -0.34 | 18.6 | 822.41 | 822.85 |
| 98.33581256972855 | -0.31 | 19.27 | 822.9 | 823.35 |
| 98.50316102640389 | -0.11 | 19.83 | 823.79 | 824.24 |
| 98.67050948307921 | -0.08 | 19.99 | 823.02 | 823.48 |
| 98.83785793975456 | -0.23 | 20.15 | 820.54 | 821.02 |
| 99.0052063964299 | -0.38 | 20.31 | 818.06 | 818.55 |
| 99.17255485310525 | -0.41 | 20.53 | 817.67 | 818.15 |
| 99.33060617329863 | -0.02 | 20.74 | 818.72 | 819.21 |
| 99.49795462997399 | 0.38 | 20.79 | 819.17 | 819.66 |
| 99.66530308664933 | 0.56 | 20.54 | 818.56 | 819.04 |
| 99.83265154332467 | 0.51 | 20.18 | 817.07 | 817.54 |
| 100.0 | 0.38 | 19.77 | 815.03 | 815.5 |